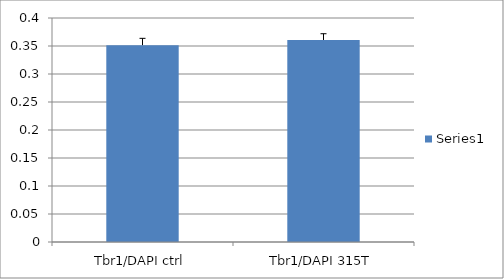
| Category | Series 0 |
|---|---|
| Tbr1/DAPI ctrl | 0.352 |
| Tbr1/DAPI 315T | 0.361 |